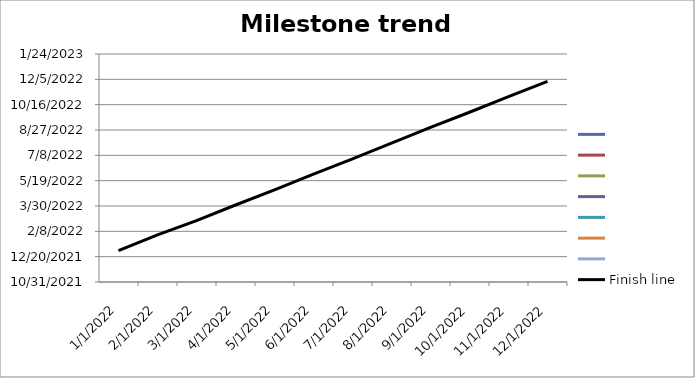
| Category | Series 0 | Series 1 | Series 2 | Series 3 | Series 4 | Series 5 | Series 6 | Finish line |
|---|---|---|---|---|---|---|---|---|
| 01.01.2022 |  |  |  |  |  |  |  | 1/1/22 |
| 01.02.2022 |  |  |  |  |  |  |  | 2/1/22 |
| 01.03.2022 |  |  |  |  |  |  |  | 3/1/22 |
| 01.04.2022 |  |  |  |  |  |  |  | 4/1/22 |
| 01.05.2022 |  |  |  |  |  |  |  | 5/1/22 |
| 01.06.2022 |  |  |  |  |  |  |  | 6/1/22 |
| 01.07.2022 |  |  |  |  |  |  |  | 7/1/22 |
| 01.08.2022 |  |  |  |  |  |  |  | 8/1/22 |
| 01.09.2022 |  |  |  |  |  |  |  | 9/1/22 |
| 01.10.2022 |  |  |  |  |  |  |  | 10/1/22 |
| 01.11.2022 |  |  |  |  |  |  |  | 11/1/22 |
| 01.12.2022 |  |  |  |  |  |  |  | 12/1/22 |